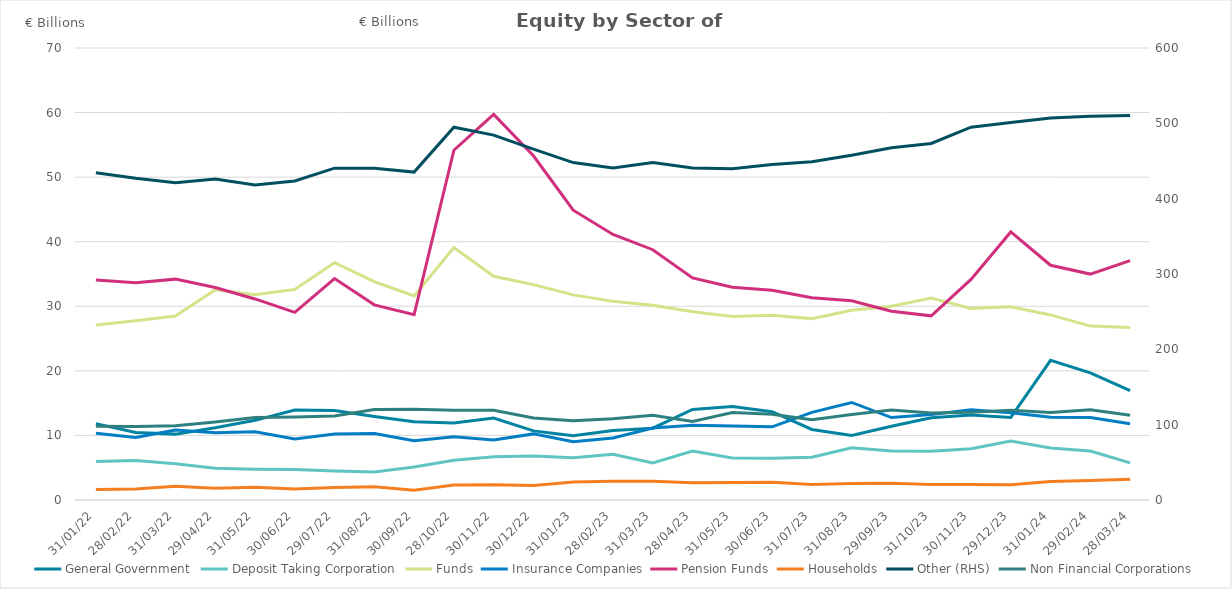
| Category | General Government | Deposit Taking Corporation | Funds | Insurance Companies | Pension Funds | Households |
|---|---|---|---|---|---|---|
| 2022-01-31 | 11.83 | 5.979 | 27.104 | 10.339 | 34.076 | 1.641 |
| 2022-02-28 | 10.462 | 6.126 | 27.762 | 9.668 | 33.63 | 1.717 |
| 2022-03-31 | 10.202 | 5.627 | 28.481 | 10.836 | 34.204 | 2.145 |
| 2022-04-29 | 11.185 | 4.919 | 32.57 | 10.408 | 32.918 | 1.813 |
| 2022-05-31 | 12.338 | 4.769 | 31.799 | 10.557 | 31.137 | 1.987 |
| 2022-06-30 | 13.939 | 4.742 | 32.614 | 9.465 | 29.053 | 1.713 |
| 2022-07-29 | 13.855 | 4.501 | 36.745 | 10.203 | 34.288 | 1.936 |
| 2022-08-31 | 12.915 | 4.338 | 33.822 | 10.296 | 30.219 | 2.051 |
| 2022-09-30 | 12.11 | 5.108 | 31.609 | 9.173 | 28.713 | 1.527 |
| 2022-10-28 | 11.933 | 6.139 | 39.096 | 9.785 | 54.166 | 2.317 |
| 2022-11-30 | 12.703 | 6.699 | 34.643 | 9.296 | 59.725 | 2.355 |
| 2022-12-30 | 10.702 | 6.826 | 33.354 | 10.238 | 53.309 | 2.245 |
| 2023-01-31 | 9.96 | 6.532 | 31.769 | 9.038 | 44.881 | 2.784 |
| 2023-02-28 | 10.751 | 7.083 | 30.764 | 9.604 | 41.117 | 2.905 |
| 2023-03-31 | 11.116 | 5.732 | 30.16 | 11.158 | 38.761 | 2.921 |
| 2023-04-28 | 14.019 | 7.587 | 29.146 | 11.566 | 34.389 | 2.668 |
| 2023-05-31 | 14.493 | 6.498 | 28.416 | 11.451 | 32.958 | 2.706 |
| 2023-06-30 | 13.667 | 6.448 | 28.62 | 11.331 | 32.478 | 2.751 |
| 2023-07-31 | 10.921 | 6.639 | 28.091 | 13.579 | 31.31 | 2.386 |
| 2023-08-31 | 10.007 | 8.09 | 29.391 | 15.107 | 30.857 | 2.541 |
| 2023-09-29 | 11.424 | 7.586 | 30.014 | 12.768 | 29.241 | 2.605 |
| 2023-10-31 | 12.743 | 7.569 | 31.289 | 13.229 | 28.523 | 2.415 |
| 2023-11-30 | 13.168 | 7.946 | 29.654 | 13.97 | 34.162 | 2.415 |
| 2023-12-29 | 12.786 | 9.134 | 29.925 | 13.528 | 41.516 | 2.345 |
| 2024-01-31 | 21.623 | 8.055 | 28.664 | 12.813 | 36.356 | 2.876 |
| 2024-02-29 | 19.686 | 7.583 | 26.935 | 12.758 | 34.987 | 3.011 |
| 2024-03-28 | 16.932 | 5.749 | 26.698 | 11.797 | 37.069 | 3.23 |